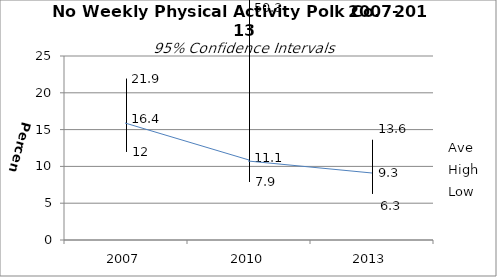
| Category | Ave | High | Low |
|---|---|---|---|
| 2007.0 | 16.4 | 21.9 | 12 |
| 2010.0 | 11.1 | 50.3 | 7.9 |
| 2013.0 | 9.3 | 13.6 | 6.3 |